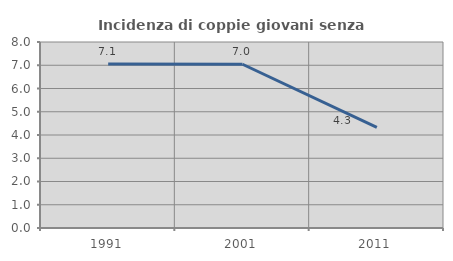
| Category | Incidenza di coppie giovani senza figli |
|---|---|
| 1991.0 | 7.052 |
| 2001.0 | 7.043 |
| 2011.0 | 4.328 |